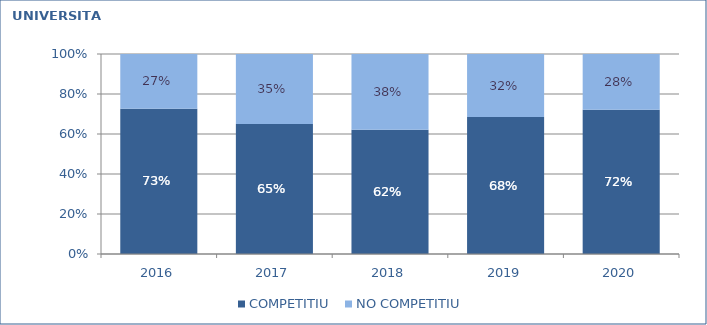
| Category | COMPETITIU  | NO COMPETITIU |
|---|---|---|
| 2016.0 | 0.727 | 0.273 |
| 2017.0 | 0.65 | 0.35 |
| 2018.0 | 0.622 | 0.378 |
| 2019.0 | 0.685 | 0.315 |
| 2020.0 | 0.722 | 0.278 |